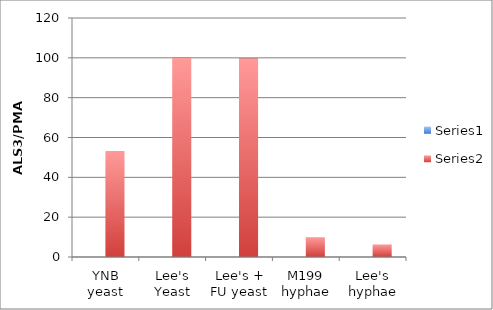
| Category | Series 0 | Series 1 |
|---|---|---|
| YNB yeast |  | 53.173 |
| Lee's Yeast |  | 100 |
| Lee's + FU yeast |  | 99.631 |
| M199 hyphae |  | 9.93 |
| Lee's hyphae |  | 6.303 |